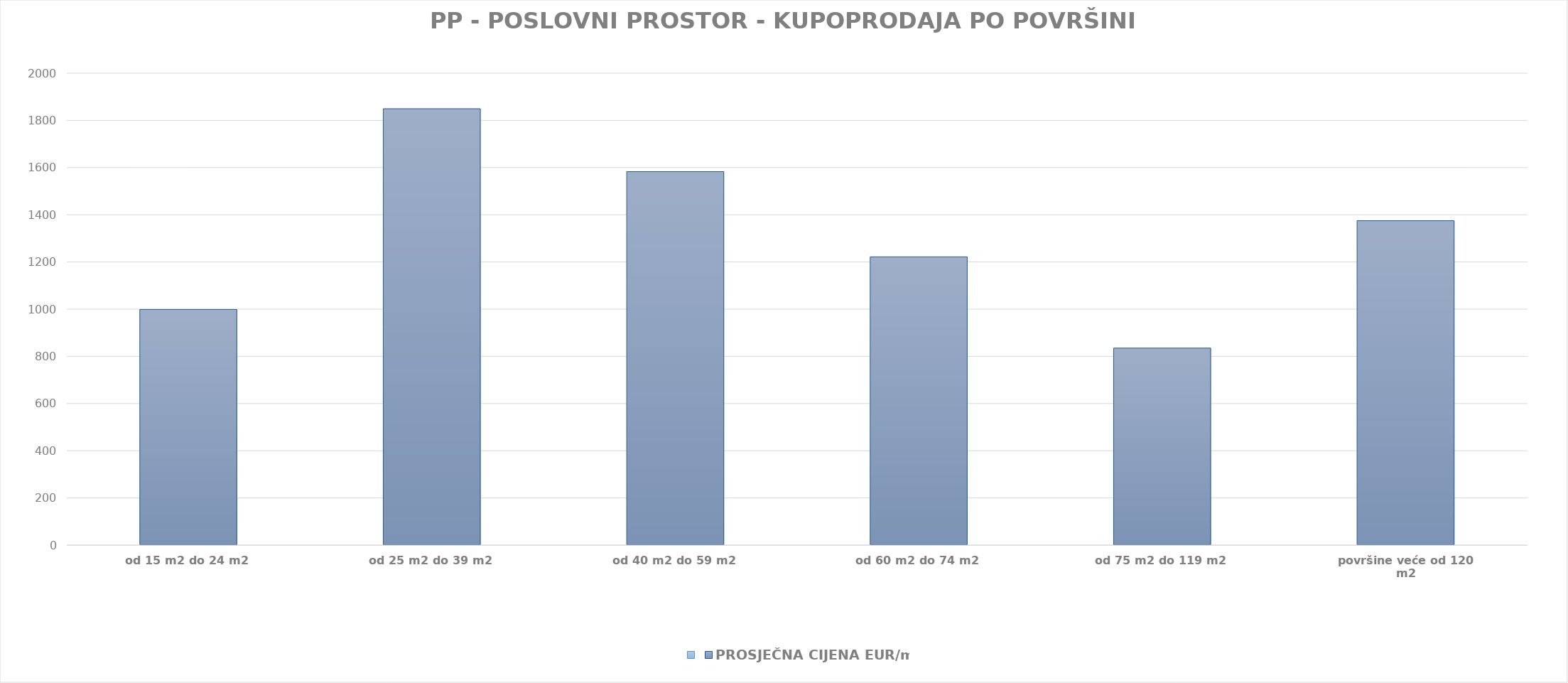
| Category | Series 0 | PROSJEČNA CIJENA EUR/m2 |
|---|---|---|
| od 15 m2 do 24 m2 |  | 1902-09-24 19:00:21 |
| od 25 m2 do 39 m2 |  | 1905-01-22 11:43:23 |
| od 40 m2 do 59 m2 |  | 1904-04-30 19:31:53 |
| od 60 m2 do 74 m2 |  | 1903-05-05 17:15:00 |
| od 75 m2 do 119 m2 |  | 1902-04-13 23:08:49 |
| površine veće od 120 m2 |  | 1903-10-05 23:19:16 |